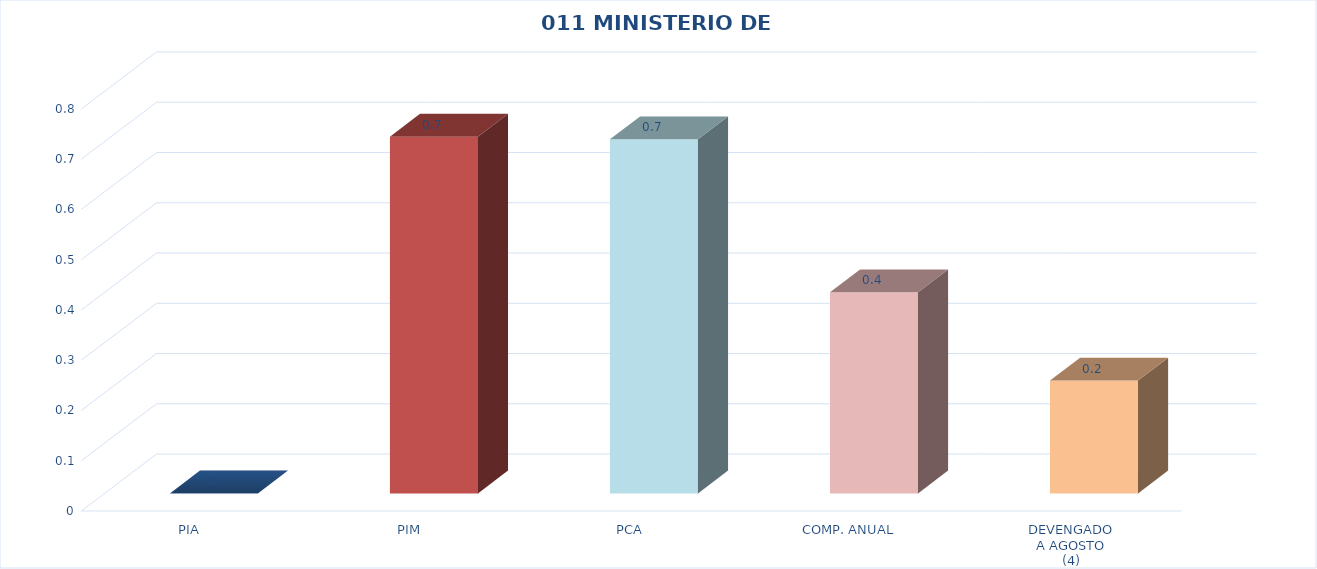
| Category | 011 MINISTERIO DE SALUD |
|---|---|
| PIA | 0 |
| PIM | 0.71 |
| PCA | 0.705 |
| COMP. ANUAL | 0.4 |
| DEVENGADO
A AGOSTO
(4) | 0.225 |